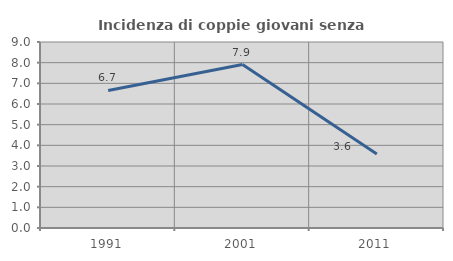
| Category | Incidenza di coppie giovani senza figli |
|---|---|
| 1991.0 | 6.656 |
| 2001.0 | 7.907 |
| 2011.0 | 3.582 |